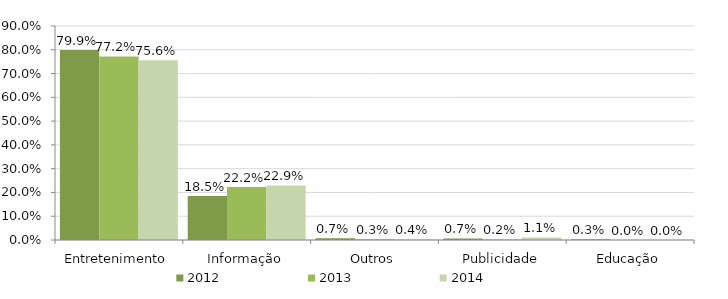
| Category | 2012 | 2013 | 2014 |
|---|---|---|---|
| Entretenimento | 0.799 | 0.772 | 0.756 |
| Informação | 0.185 | 0.222 | 0.229 |
| Outros | 0.007 | 0.003 | 0.004 |
| Publicidade | 0.007 | 0.002 | 0.011 |
| Educação | 0.003 | 0 | 0 |